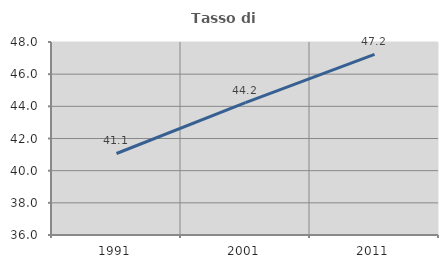
| Category | Tasso di occupazione   |
|---|---|
| 1991.0 | 41.068 |
| 2001.0 | 44.228 |
| 2011.0 | 47.235 |